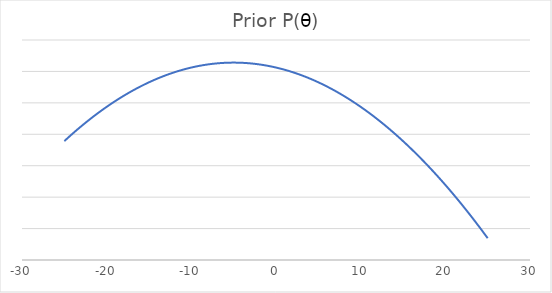
| Category | Series 0 |
|---|---|
| -25.0 | 0.003 |
| -24.0 | 0.003 |
| -23.0 | 0.003 |
| -22.0 | 0.003 |
| -21.0 | 0.003 |
| -20.0 | 0.003 |
| -19.0 | 0.003 |
| -18.0 | 0.003 |
| -17.0 | 0.003 |
| -16.0 | 0.003 |
| -15.0 | 0.003 |
| -14.0 | 0.003 |
| -13.0 | 0.003 |
| -12.0 | 0.003 |
| -11.0 | 0.003 |
| -10.0 | 0.003 |
| -9.0 | 0.003 |
| -8.0 | 0.003 |
| -7.0 | 0.003 |
| -6.0 | 0.003 |
| -5.0 | 0.003 |
| -4.0 | 0.003 |
| -3.0 | 0.003 |
| -2.0 | 0.003 |
| -1.0 | 0.003 |
| 0.0 | 0.003 |
| 1.0 | 0.003 |
| 2.0 | 0.003 |
| 3.0 | 0.003 |
| 4.0 | 0.003 |
| 5.0 | 0.003 |
| 6.0 | 0.003 |
| 7.0 | 0.003 |
| 8.0 | 0.003 |
| 9.0 | 0.003 |
| 10.0 | 0.003 |
| 11.0 | 0.003 |
| 12.0 | 0.003 |
| 13.0 | 0.003 |
| 14.0 | 0.003 |
| 15.0 | 0.003 |
| 16.0 | 0.003 |
| 17.0 | 0.003 |
| 18.0 | 0.003 |
| 19.0 | 0.003 |
| 20.0 | 0.003 |
| 21.0 | 0.003 |
| 22.0 | 0.003 |
| 23.0 | 0.003 |
| 24.0 | 0.003 |
| 25.0 | 0.003 |